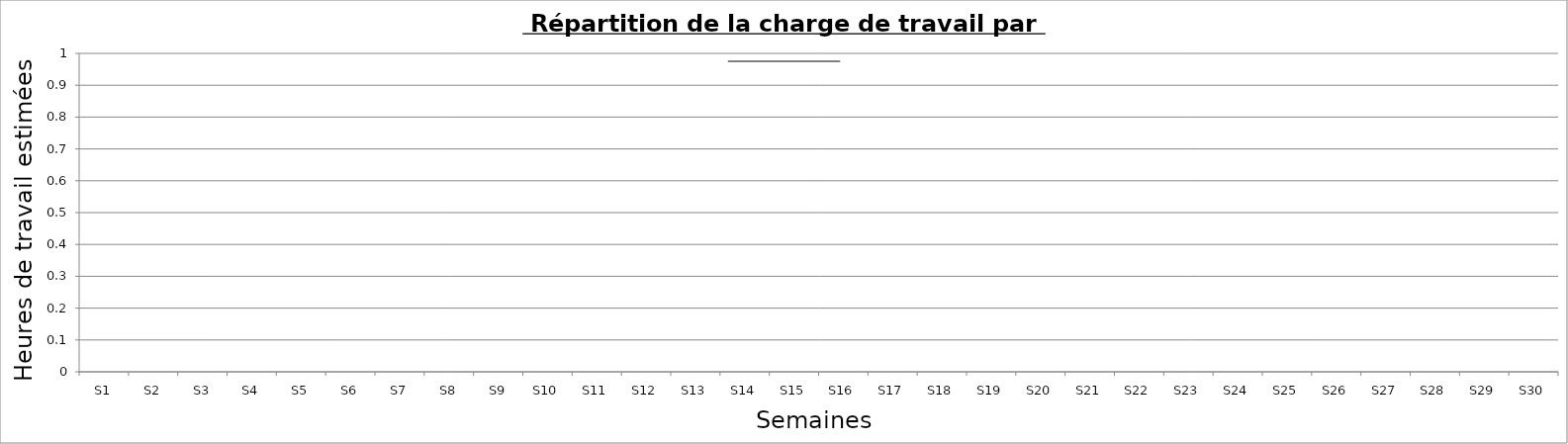
| Category | Series 2 |
|---|---|
| S1 | 0 |
| S2 | 0 |
| S3 | 0 |
| S4 | 0 |
| S5 | 0 |
| S6 | 0 |
| S7 | 0 |
| S8 | 0 |
| S9 | 0 |
| S10 | 0 |
| S11 | 0 |
| S12 | 0 |
| S13 | 0 |
| S14 | 0 |
| S15 | 0 |
| S16 | 0 |
| S17 | 0 |
| S18 | 0 |
| S19 | 0 |
| S20 | 0 |
| S21 | 0 |
| S22 | 0 |
| S23 | 0 |
| S24 | 0 |
| S25 | 0 |
| S26 | 0 |
| S27 | 0 |
| S28 | 0 |
| S29 | 0 |
| S30 | 0 |